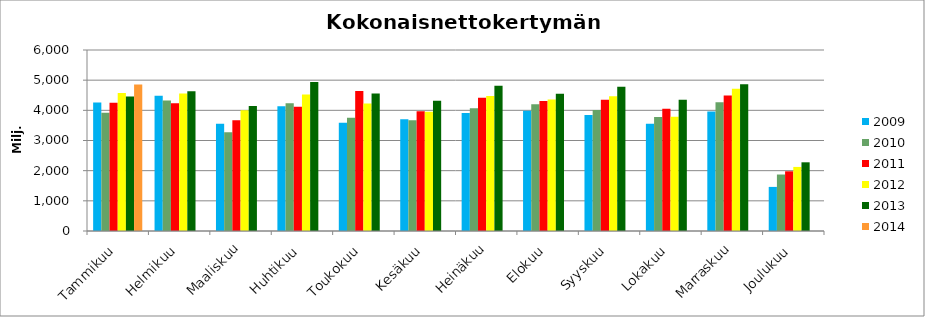
| Category | 2009 | 2010 | 2011 | 2012 | 2013 | 2014 |
|---|---|---|---|---|---|---|
| Tammikuu | 4262.104 | 3920.596 | 4254.457 | 4574.273 | 4458.574 | 4859.611 |
| Helmikuu | 4482.61 | 4324.273 | 4236.531 | 4556.683 | 4631.184 | 0 |
| Maaliskuu | 3551.222 | 3273.1 | 3667.911 | 4003.705 | 4141.995 | 0 |
| Huhtikuu | 4137.11 | 4235.283 | 4118.677 | 4521.853 | 4938.018 | 0 |
| Toukokuu | 3589.232 | 3758.246 | 4645.002 | 4229.781 | 4554.199 | 0 |
| Kesäkuu | 3701.617 | 3667.134 | 3966.073 | 3950.962 | 4320.908 | 0 |
| Heinäkuu | 3908.058 | 4070.751 | 4417.867 | 4473.488 | 4813.288 | 0 |
| Elokuu | 3983.999 | 4202.024 | 4310.334 | 4361.243 | 4548.338 | 0 |
| Syyskuu | 3843.197 | 4009.059 | 4353.55 | 4465.954 | 4780.078 | 0 |
| Lokakuu | 3558.554 | 3781.91 | 4052.329 | 3783.435 | 4353.533 | 0 |
| Marraskuu | 3964.456 | 4269.91 | 4491.275 | 4716.744 | 4864.184 | 0 |
| Joulukuu | 1461.632 | 1872.231 | 1978.993 | 2124.114 | 2277.179 | 0 |